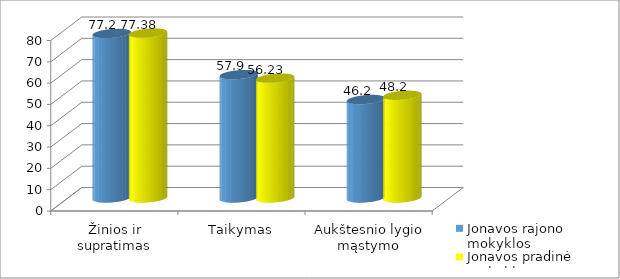
| Category | Jonavos rajono mokyklos | Jonavos pradinė mokykla |
|---|---|---|
| Žinios ir supratimas | 77.2 | 77.38 |
| Taikymas | 57.9 | 56.23 |
| Aukštesnio lygio mąstymo gebėjimai | 46.2 | 48.2 |